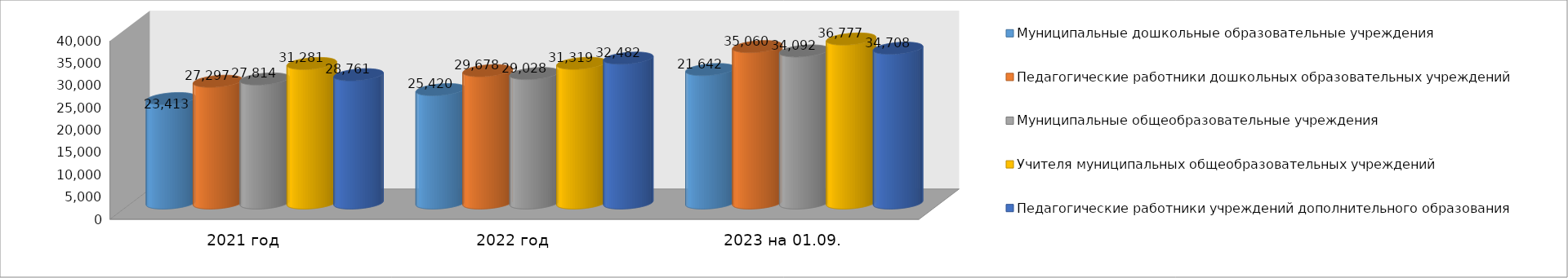
| Category | Муниципальные дошкольные образовательные учреждения | Педагогические работники дошкольных образовательных учреждений | Муниципальные общеобразовательные учреждения | Учителя муниципальных общеобразовательных учреждений | Педагогические работники учреждений дополнительного образования |
|---|---|---|---|---|---|
| 2021 год | 23413 | 27297 | 27814 | 31281 | 28761 |
| 2022 год | 25420 | 29678 | 29028 | 31319 | 32482 |
| 2023 на 01.09. | 29922 | 35060 | 34092 | 36777 | 34708 |